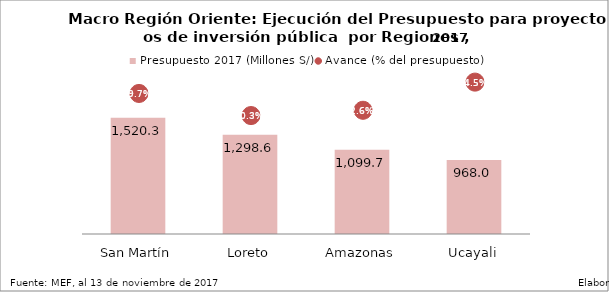
| Category | Presupuesto 2017 (Millones S/) |
|---|---|
| San Martín | 1520.297 |
| Loreto | 1298.584 |
| Amazonas | 1099.689 |
| Ucayali | 968.036 |